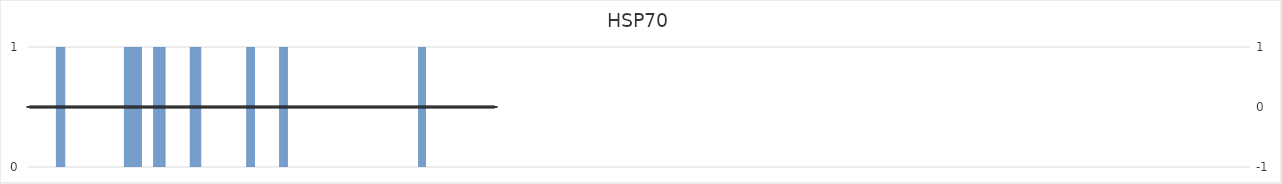
| Category | HSP70 |
|---|---|
| 1.0 | 0 |
| 2.0 | 0 |
| 3.0 | 0 |
| 4.0 | 0 |
| 5.0 | 0 |
| 6.0 | 0 |
| 7.0 | 0 |
| 8.0 | 0 |
| 9.0 | 0 |
| 10.0 | 0 |
| 11.0 | 0 |
| 12.0 | 0 |
| 13.0 | 0 |
| 14.0 | 0 |
| 15.0 | 0 |
| 16.0 | 0 |
| 17.0 | 0 |
| 18.0 | 0 |
| 19.0 | 0 |
| 20.0 | 0 |
| 21.0 | 0 |
| 22.0 | 0 |
| 23.0 | 0 |
| 24.0 | 0 |
| 25.0 | 0 |
| 26.0 | 0 |
| 27.0 | 0 |
| 28.0 | 0 |
| 29.0 | 0 |
| 30.0 | 0 |
| 31.0 | 0 |
| 32.0 | 0 |
| 33.0 | 0 |
| 34.0 | 0 |
| 35.0 | 0 |
| 36.0 | 0 |
| 37.0 | 0 |
| 38.0 | 0 |
| 39.0 | 0 |
| 40.0 | 1 |
| 41.0 | 1 |
| 42.0 | 1 |
| 43.0 | 1 |
| 44.0 | 1 |
| 45.0 | 1 |
| 46.0 | 1 |
| 47.0 | 1 |
| 48.0 | 1 |
| 49.0 | 1 |
| 50.0 | 1 |
| 51.0 | 1 |
| 52.0 | 1 |
| 53.0 | 0 |
| 54.0 | 0 |
| 55.0 | 0 |
| 56.0 | 0 |
| 57.0 | 0 |
| 58.0 | 0 |
| 59.0 | 0 |
| 60.0 | 0 |
| 61.0 | 0 |
| 62.0 | 0 |
| 63.0 | 0 |
| 64.0 | 0 |
| 65.0 | 0 |
| 66.0 | 0 |
| 67.0 | 0 |
| 68.0 | 0 |
| 69.0 | 0 |
| 70.0 | 0 |
| 71.0 | 0 |
| 72.0 | 0 |
| 73.0 | 0 |
| 74.0 | 0 |
| 75.0 | 0 |
| 76.0 | 0 |
| 77.0 | 0 |
| 78.0 | 0 |
| 79.0 | 0 |
| 80.0 | 0 |
| 81.0 | 0 |
| 82.0 | 0 |
| 83.0 | 0 |
| 84.0 | 0 |
| 85.0 | 0 |
| 86.0 | 0 |
| 87.0 | 0 |
| 88.0 | 0 |
| 89.0 | 0 |
| 90.0 | 0 |
| 91.0 | 0 |
| 92.0 | 0 |
| 93.0 | 0 |
| 94.0 | 0 |
| 95.0 | 0 |
| 96.0 | 0 |
| 97.0 | 0 |
| 98.0 | 0 |
| 99.0 | 0 |
| 100.0 | 0 |
| 101.0 | 0 |
| 102.0 | 0 |
| 103.0 | 0 |
| 104.0 | 0 |
| 105.0 | 0 |
| 106.0 | 0 |
| 107.0 | 0 |
| 108.0 | 0 |
| 109.0 | 0 |
| 110.0 | 0 |
| 111.0 | 0 |
| 112.0 | 0 |
| 113.0 | 0 |
| 114.0 | 0 |
| 115.0 | 0 |
| 116.0 | 0 |
| 117.0 | 0 |
| 118.0 | 0 |
| 119.0 | 0 |
| 120.0 | 0 |
| 121.0 | 0 |
| 122.0 | 0 |
| 123.0 | 0 |
| 124.0 | 0 |
| 125.0 | 0 |
| 126.0 | 0 |
| 127.0 | 0 |
| 128.0 | 0 |
| 129.0 | 0 |
| 130.0 | 0 |
| 131.0 | 0 |
| 132.0 | 0 |
| 133.0 | 0 |
| 134.0 | 0 |
| 135.0 | 1 |
| 136.0 | 1 |
| 137.0 | 1 |
| 138.0 | 1 |
| 139.0 | 1 |
| 140.0 | 1 |
| 141.0 | 1 |
| 142.0 | 1 |
| 143.0 | 1 |
| 144.0 | 1 |
| 145.0 | 1 |
| 146.0 | 1 |
| 147.0 | 1 |
| 148.0 | 1 |
| 149.0 | 1 |
| 150.0 | 1 |
| 151.0 | 1 |
| 152.0 | 1 |
| 153.0 | 1 |
| 154.0 | 1 |
| 155.0 | 1 |
| 156.0 | 1 |
| 157.0 | 1 |
| 158.0 | 1 |
| 159.0 | 1 |
| 160.0 | 0 |
| 161.0 | 0 |
| 162.0 | 0 |
| 163.0 | 0 |
| 164.0 | 0 |
| 165.0 | 0 |
| 166.0 | 0 |
| 167.0 | 0 |
| 168.0 | 0 |
| 169.0 | 0 |
| 170.0 | 0 |
| 171.0 | 0 |
| 172.0 | 0 |
| 173.0 | 0 |
| 174.0 | 0 |
| 175.0 | 0 |
| 176.0 | 1 |
| 177.0 | 1 |
| 178.0 | 1 |
| 179.0 | 1 |
| 180.0 | 1 |
| 181.0 | 1 |
| 182.0 | 1 |
| 183.0 | 1 |
| 184.0 | 1 |
| 185.0 | 1 |
| 186.0 | 1 |
| 187.0 | 1 |
| 188.0 | 1 |
| 189.0 | 1 |
| 190.0 | 1 |
| 191.0 | 1 |
| 192.0 | 1 |
| 193.0 | 0 |
| 194.0 | 0 |
| 195.0 | 0 |
| 196.0 | 0 |
| 197.0 | 0 |
| 198.0 | 0 |
| 199.0 | 0 |
| 200.0 | 0 |
| 201.0 | 0 |
| 202.0 | 0 |
| 203.0 | 0 |
| 204.0 | 0 |
| 205.0 | 0 |
| 206.0 | 0 |
| 207.0 | 0 |
| 208.0 | 0 |
| 209.0 | 0 |
| 210.0 | 0 |
| 211.0 | 0 |
| 212.0 | 0 |
| 213.0 | 0 |
| 214.0 | 0 |
| 215.0 | 0 |
| 216.0 | 0 |
| 217.0 | 0 |
| 218.0 | 0 |
| 219.0 | 0 |
| 220.0 | 0 |
| 221.0 | 0 |
| 222.0 | 0 |
| 223.0 | 0 |
| 224.0 | 0 |
| 225.0 | 0 |
| 226.0 | 0 |
| 227.0 | 1 |
| 228.0 | 1 |
| 229.0 | 1 |
| 230.0 | 1 |
| 231.0 | 1 |
| 232.0 | 1 |
| 233.0 | 1 |
| 234.0 | 1 |
| 235.0 | 1 |
| 236.0 | 1 |
| 237.0 | 1 |
| 238.0 | 1 |
| 239.0 | 1 |
| 240.0 | 1 |
| 241.0 | 1 |
| 242.0 | 1 |
| 243.0 | 0 |
| 244.0 | 0 |
| 245.0 | 0 |
| 246.0 | 0 |
| 247.0 | 0 |
| 248.0 | 0 |
| 249.0 | 0 |
| 250.0 | 0 |
| 251.0 | 0 |
| 252.0 | 0 |
| 253.0 | 0 |
| 254.0 | 0 |
| 255.0 | 0 |
| 256.0 | 0 |
| 257.0 | 0 |
| 258.0 | 0 |
| 259.0 | 0 |
| 260.0 | 0 |
| 261.0 | 0 |
| 262.0 | 0 |
| 263.0 | 0 |
| 264.0 | 0 |
| 265.0 | 0 |
| 266.0 | 0 |
| 267.0 | 0 |
| 268.0 | 0 |
| 269.0 | 0 |
| 270.0 | 0 |
| 271.0 | 0 |
| 272.0 | 0 |
| 273.0 | 0 |
| 274.0 | 0 |
| 275.0 | 0 |
| 276.0 | 0 |
| 277.0 | 0 |
| 278.0 | 0 |
| 279.0 | 0 |
| 280.0 | 0 |
| 281.0 | 0 |
| 282.0 | 0 |
| 283.0 | 0 |
| 284.0 | 0 |
| 285.0 | 0 |
| 286.0 | 0 |
| 287.0 | 0 |
| 288.0 | 0 |
| 289.0 | 0 |
| 290.0 | 0 |
| 291.0 | 0 |
| 292.0 | 0 |
| 293.0 | 0 |
| 294.0 | 0 |
| 295.0 | 0 |
| 296.0 | 0 |
| 297.0 | 0 |
| 298.0 | 0 |
| 299.0 | 0 |
| 300.0 | 0 |
| 301.0 | 0 |
| 302.0 | 0 |
| 303.0 | 0 |
| 304.0 | 0 |
| 305.0 | 0 |
| 306.0 | 1 |
| 307.0 | 1 |
| 308.0 | 1 |
| 309.0 | 1 |
| 310.0 | 1 |
| 311.0 | 1 |
| 312.0 | 1 |
| 313.0 | 1 |
| 314.0 | 1 |
| 315.0 | 1 |
| 316.0 | 1 |
| 317.0 | 1 |
| 318.0 | 0 |
| 319.0 | 0 |
| 320.0 | 0 |
| 321.0 | 0 |
| 322.0 | 0 |
| 323.0 | 0 |
| 324.0 | 0 |
| 325.0 | 0 |
| 326.0 | 0 |
| 327.0 | 0 |
| 328.0 | 0 |
| 329.0 | 0 |
| 330.0 | 0 |
| 331.0 | 0 |
| 332.0 | 0 |
| 333.0 | 0 |
| 334.0 | 0 |
| 335.0 | 0 |
| 336.0 | 0 |
| 337.0 | 0 |
| 338.0 | 0 |
| 339.0 | 0 |
| 340.0 | 0 |
| 341.0 | 0 |
| 342.0 | 0 |
| 343.0 | 0 |
| 344.0 | 0 |
| 345.0 | 0 |
| 346.0 | 0 |
| 347.0 | 0 |
| 348.0 | 0 |
| 349.0 | 0 |
| 350.0 | 0 |
| 351.0 | 0 |
| 352.0 | 1 |
| 353.0 | 1 |
| 354.0 | 1 |
| 355.0 | 1 |
| 356.0 | 1 |
| 357.0 | 1 |
| 358.0 | 1 |
| 359.0 | 1 |
| 360.0 | 1 |
| 361.0 | 1 |
| 362.0 | 1 |
| 363.0 | 1 |
| 364.0 | 0 |
| 365.0 | 0 |
| 366.0 | 0 |
| 367.0 | 0 |
| 368.0 | 0 |
| 369.0 | 0 |
| 370.0 | 0 |
| 371.0 | 0 |
| 372.0 | 0 |
| 373.0 | 0 |
| 374.0 | 0 |
| 375.0 | 0 |
| 376.0 | 0 |
| 377.0 | 0 |
| 378.0 | 0 |
| 379.0 | 0 |
| 380.0 | 0 |
| 381.0 | 0 |
| 382.0 | 0 |
| 383.0 | 0 |
| 384.0 | 0 |
| 385.0 | 0 |
| 386.0 | 0 |
| 387.0 | 0 |
| 388.0 | 0 |
| 389.0 | 0 |
| 390.0 | 0 |
| 391.0 | 0 |
| 392.0 | 0 |
| 393.0 | 0 |
| 394.0 | 0 |
| 395.0 | 0 |
| 396.0 | 0 |
| 397.0 | 0 |
| 398.0 | 0 |
| 399.0 | 0 |
| 400.0 | 0 |
| 401.0 | 0 |
| 402.0 | 0 |
| 403.0 | 0 |
| 404.0 | 0 |
| 405.0 | 0 |
| 406.0 | 0 |
| 407.0 | 0 |
| 408.0 | 0 |
| 409.0 | 0 |
| 410.0 | 0 |
| 411.0 | 0 |
| 412.0 | 0 |
| 413.0 | 0 |
| 414.0 | 0 |
| 415.0 | 0 |
| 416.0 | 0 |
| 417.0 | 0 |
| 418.0 | 0 |
| 419.0 | 0 |
| 420.0 | 0 |
| 421.0 | 0 |
| 422.0 | 0 |
| 423.0 | 0 |
| 424.0 | 0 |
| 425.0 | 0 |
| 426.0 | 0 |
| 427.0 | 0 |
| 428.0 | 0 |
| 429.0 | 0 |
| 430.0 | 0 |
| 431.0 | 0 |
| 432.0 | 0 |
| 433.0 | 0 |
| 434.0 | 0 |
| 435.0 | 0 |
| 436.0 | 0 |
| 437.0 | 0 |
| 438.0 | 0 |
| 439.0 | 0 |
| 440.0 | 0 |
| 441.0 | 0 |
| 442.0 | 0 |
| 443.0 | 0 |
| 444.0 | 0 |
| 445.0 | 0 |
| 446.0 | 0 |
| 447.0 | 0 |
| 448.0 | 0 |
| 449.0 | 0 |
| 450.0 | 0 |
| 451.0 | 0 |
| 452.0 | 0 |
| 453.0 | 0 |
| 454.0 | 0 |
| 455.0 | 0 |
| 456.0 | 0 |
| 457.0 | 0 |
| 458.0 | 0 |
| 459.0 | 0 |
| 460.0 | 0 |
| 461.0 | 0 |
| 462.0 | 0 |
| 463.0 | 0 |
| 464.0 | 0 |
| 465.0 | 0 |
| 466.0 | 0 |
| 467.0 | 0 |
| 468.0 | 0 |
| 469.0 | 0 |
| 470.0 | 0 |
| 471.0 | 0 |
| 472.0 | 0 |
| 473.0 | 0 |
| 474.0 | 0 |
| 475.0 | 0 |
| 476.0 | 0 |
| 477.0 | 0 |
| 478.0 | 0 |
| 479.0 | 0 |
| 480.0 | 0 |
| 481.0 | 0 |
| 482.0 | 0 |
| 483.0 | 0 |
| 484.0 | 0 |
| 485.0 | 0 |
| 486.0 | 0 |
| 487.0 | 0 |
| 488.0 | 0 |
| 489.0 | 0 |
| 490.0 | 0 |
| 491.0 | 0 |
| 492.0 | 0 |
| 493.0 | 0 |
| 494.0 | 0 |
| 495.0 | 0 |
| 496.0 | 0 |
| 497.0 | 0 |
| 498.0 | 0 |
| 499.0 | 0 |
| 500.0 | 0 |
| 501.0 | 0 |
| 502.0 | 0 |
| 503.0 | 0 |
| 504.0 | 0 |
| 505.0 | 0 |
| 506.0 | 0 |
| 507.0 | 0 |
| 508.0 | 0 |
| 509.0 | 0 |
| 510.0 | 0 |
| 511.0 | 0 |
| 512.0 | 0 |
| 513.0 | 0 |
| 514.0 | 0 |
| 515.0 | 0 |
| 516.0 | 0 |
| 517.0 | 0 |
| 518.0 | 0 |
| 519.0 | 0 |
| 520.0 | 0 |
| 521.0 | 0 |
| 522.0 | 0 |
| 523.0 | 0 |
| 524.0 | 0 |
| 525.0 | 0 |
| 526.0 | 0 |
| 527.0 | 0 |
| 528.0 | 0 |
| 529.0 | 0 |
| 530.0 | 0 |
| 531.0 | 0 |
| 532.0 | 0 |
| 533.0 | 0 |
| 534.0 | 0 |
| 535.0 | 0 |
| 536.0 | 0 |
| 537.0 | 0 |
| 538.0 | 0 |
| 539.0 | 0 |
| 540.0 | 0 |
| 541.0 | 0 |
| 542.0 | 0 |
| 543.0 | 0 |
| 544.0 | 0 |
| 545.0 | 0 |
| 546.0 | 1 |
| 547.0 | 1 |
| 548.0 | 1 |
| 549.0 | 1 |
| 550.0 | 1 |
| 551.0 | 1 |
| 552.0 | 1 |
| 553.0 | 1 |
| 554.0 | 1 |
| 555.0 | 1 |
| 556.0 | 1 |
| 557.0 | 0 |
| 558.0 | 0 |
| 559.0 | 0 |
| 560.0 | 0 |
| 561.0 | 0 |
| 562.0 | 0 |
| 563.0 | 0 |
| 564.0 | 0 |
| 565.0 | 0 |
| 566.0 | 0 |
| 567.0 | 0 |
| 568.0 | 0 |
| 569.0 | 0 |
| 570.0 | 0 |
| 571.0 | 0 |
| 572.0 | 0 |
| 573.0 | 0 |
| 574.0 | 0 |
| 575.0 | 0 |
| 576.0 | 0 |
| 577.0 | 0 |
| 578.0 | 0 |
| 579.0 | 0 |
| 580.0 | 0 |
| 581.0 | 0 |
| 582.0 | 0 |
| 583.0 | 0 |
| 584.0 | 0 |
| 585.0 | 0 |
| 586.0 | 0 |
| 587.0 | 0 |
| 588.0 | 0 |
| 589.0 | 0 |
| 590.0 | 0 |
| 591.0 | 0 |
| 592.0 | 0 |
| 593.0 | 0 |
| 594.0 | 0 |
| 595.0 | 0 |
| 596.0 | 0 |
| 597.0 | 0 |
| 598.0 | 0 |
| 599.0 | 0 |
| 600.0 | 0 |
| 601.0 | 0 |
| 602.0 | 0 |
| 603.0 | 0 |
| 604.0 | 0 |
| 605.0 | 0 |
| 606.0 | 0 |
| 607.0 | 0 |
| 608.0 | 0 |
| 609.0 | 0 |
| 610.0 | 0 |
| 611.0 | 0 |
| 612.0 | 0 |
| 613.0 | 0 |
| 614.0 | 0 |
| 615.0 | 0 |
| 616.0 | 0 |
| 617.0 | 0 |
| 618.0 | 0 |
| 619.0 | 0 |
| 620.0 | 0 |
| 621.0 | 0 |
| 622.0 | 0 |
| 623.0 | 0 |
| 624.0 | 0 |
| 625.0 | 0 |
| 626.0 | 0 |
| 627.0 | 0 |
| 628.0 | 0 |
| 629.0 | 0 |
| 630.0 | 0 |
| 631.0 | 0 |
| 632.0 | 0 |
| 633.0 | 0 |
| 634.0 | 0 |
| 635.0 | 0 |
| 636.0 | 0 |
| 637.0 | 0 |
| 638.0 | 0 |
| 639.0 | 0 |
| 640.0 | 0 |
| 641.0 | 0 |
| 642.0 | 0 |
| 643.0 | 0 |
| 644.0 | 0 |
| 645.0 | 0 |
| 646.0 | 0 |
| 647.0 | 0 |
| 648.0 | 0 |
| 649.0 | 0 |
| 650.0 | 0 |
| 651.0 | 0 |
| 652.0 | 0 |
| 653.0 | 0 |
| 654.0 | 0 |
| 655.0 | 0 |
| 656.0 | 0 |
| 657.0 | 0 |
| 658.0 | 0 |
| 659.0 | 0 |
| 660.0 | 0 |
| 661.0 | 0 |
| 662.0 | 0 |
| 663.0 | 0 |
| 664.0 | 0 |
| 665.0 | 0 |
| 666.0 | 0 |
| 667.0 | 0 |
| 668.0 | 0 |
| 669.0 | 0 |
| 670.0 | 0 |
| 671.0 | 0 |
| 672.0 | 0 |
| 673.0 | 0 |
| 674.0 | 0 |
| 675.0 | 0 |
| 676.0 | 0 |
| 677.0 | 0 |
| 678.0 | 0 |
| 679.0 | 0 |
| 680.0 | 0 |
| 681.0 | 0 |
| 682.0 | 0 |
| 683.0 | 0 |
| 684.0 | 0 |
| 685.0 | 0 |
| 686.0 | 0 |
| 687.0 | 0 |
| 688.0 | 0 |
| 689.0 | 0 |
| 690.0 | 0 |
| 691.0 | 0 |
| 692.0 | 0 |
| 693.0 | 0 |
| 694.0 | 0 |
| 695.0 | 0 |
| 696.0 | 0 |
| 697.0 | 0 |
| 698.0 | 0 |
| 699.0 | 0 |
| 700.0 | 0 |
| 701.0 | 0 |
| 702.0 | 0 |
| 703.0 | 0 |
| 704.0 | 0 |
| 705.0 | 0 |
| 706.0 | 0 |
| 707.0 | 0 |
| 708.0 | 0 |
| 709.0 | 0 |
| 710.0 | 0 |
| 711.0 | 0 |
| 712.0 | 0 |
| 713.0 | 0 |
| 714.0 | 0 |
| 715.0 | 0 |
| 716.0 | 0 |
| 717.0 | 0 |
| 718.0 | 0 |
| 719.0 | 0 |
| 720.0 | 0 |
| 721.0 | 0 |
| 722.0 | 0 |
| 723.0 | 0 |
| 724.0 | 0 |
| 725.0 | 0 |
| 726.0 | 0 |
| 727.0 | 0 |
| 728.0 | 0 |
| 729.0 | 0 |
| 730.0 | 0 |
| 731.0 | 0 |
| 732.0 | 0 |
| 733.0 | 0 |
| 734.0 | 0 |
| 735.0 | 0 |
| 736.0 | 0 |
| 737.0 | 0 |
| 738.0 | 0 |
| 739.0 | 0 |
| 740.0 | 0 |
| 741.0 | 0 |
| 742.0 | 0 |
| 743.0 | 0 |
| 744.0 | 0 |
| 745.0 | 0 |
| 746.0 | 0 |
| 747.0 | 0 |
| 748.0 | 0 |
| 749.0 | 0 |
| 750.0 | 0 |
| 751.0 | 0 |
| 752.0 | 0 |
| 753.0 | 0 |
| 754.0 | 0 |
| 755.0 | 0 |
| 756.0 | 0 |
| 757.0 | 0 |
| 758.0 | 0 |
| 759.0 | 0 |
| 760.0 | 0 |
| 761.0 | 0 |
| 762.0 | 0 |
| 763.0 | 0 |
| 764.0 | 0 |
| 765.0 | 0 |
| 766.0 | 0 |
| 767.0 | 0 |
| 768.0 | 0 |
| 769.0 | 0 |
| 770.0 | 0 |
| 771.0 | 0 |
| 772.0 | 0 |
| 773.0 | 0 |
| 774.0 | 0 |
| 775.0 | 0 |
| 776.0 | 0 |
| 777.0 | 0 |
| 778.0 | 0 |
| 779.0 | 0 |
| 780.0 | 0 |
| 781.0 | 0 |
| 782.0 | 0 |
| 783.0 | 0 |
| 784.0 | 0 |
| 785.0 | 0 |
| 786.0 | 0 |
| 787.0 | 0 |
| 788.0 | 0 |
| 789.0 | 0 |
| 790.0 | 0 |
| 791.0 | 0 |
| 792.0 | 0 |
| 793.0 | 0 |
| 794.0 | 0 |
| 795.0 | 0 |
| 796.0 | 0 |
| 797.0 | 0 |
| 798.0 | 0 |
| 799.0 | 0 |
| 800.0 | 0 |
| 801.0 | 0 |
| 802.0 | 0 |
| 803.0 | 0 |
| 804.0 | 0 |
| 805.0 | 0 |
| 806.0 | 0 |
| 807.0 | 0 |
| 808.0 | 0 |
| 809.0 | 0 |
| 810.0 | 0 |
| 811.0 | 0 |
| 812.0 | 0 |
| 813.0 | 0 |
| 814.0 | 0 |
| 815.0 | 0 |
| 816.0 | 0 |
| 817.0 | 0 |
| 818.0 | 0 |
| 819.0 | 0 |
| 820.0 | 0 |
| 821.0 | 0 |
| 822.0 | 0 |
| 823.0 | 0 |
| 824.0 | 0 |
| 825.0 | 0 |
| 826.0 | 0 |
| 827.0 | 0 |
| 828.0 | 0 |
| 829.0 | 0 |
| 830.0 | 0 |
| 831.0 | 0 |
| 832.0 | 0 |
| 833.0 | 0 |
| 834.0 | 0 |
| 835.0 | 0 |
| 836.0 | 0 |
| 837.0 | 0 |
| 838.0 | 0 |
| 839.0 | 0 |
| 840.0 | 0 |
| 841.0 | 0 |
| 842.0 | 0 |
| 843.0 | 0 |
| 844.0 | 0 |
| 845.0 | 0 |
| 846.0 | 0 |
| 847.0 | 0 |
| 848.0 | 0 |
| 849.0 | 0 |
| 850.0 | 0 |
| 851.0 | 0 |
| 852.0 | 0 |
| 853.0 | 0 |
| 854.0 | 0 |
| 855.0 | 0 |
| 856.0 | 0 |
| 857.0 | 0 |
| 858.0 | 0 |
| 859.0 | 0 |
| 860.0 | 0 |
| 861.0 | 0 |
| 862.0 | 0 |
| 863.0 | 0 |
| 864.0 | 0 |
| 865.0 | 0 |
| 866.0 | 0 |
| 867.0 | 0 |
| 868.0 | 0 |
| 869.0 | 0 |
| 870.0 | 0 |
| 871.0 | 0 |
| 872.0 | 0 |
| 873.0 | 0 |
| 874.0 | 0 |
| 875.0 | 0 |
| 876.0 | 0 |
| 877.0 | 0 |
| 878.0 | 0 |
| 879.0 | 0 |
| 880.0 | 0 |
| 881.0 | 0 |
| 882.0 | 0 |
| 883.0 | 0 |
| 884.0 | 0 |
| 885.0 | 0 |
| 886.0 | 0 |
| 887.0 | 0 |
| 888.0 | 0 |
| 889.0 | 0 |
| 890.0 | 0 |
| 891.0 | 0 |
| 892.0 | 0 |
| 893.0 | 0 |
| 894.0 | 0 |
| 895.0 | 0 |
| 896.0 | 0 |
| 897.0 | 0 |
| 898.0 | 0 |
| 899.0 | 0 |
| 900.0 | 0 |
| 901.0 | 0 |
| 902.0 | 0 |
| 903.0 | 0 |
| 904.0 | 0 |
| 905.0 | 0 |
| 906.0 | 0 |
| 907.0 | 0 |
| 908.0 | 0 |
| 909.0 | 0 |
| 910.0 | 0 |
| 911.0 | 0 |
| 912.0 | 0 |
| 913.0 | 0 |
| 914.0 | 0 |
| 915.0 | 0 |
| 916.0 | 0 |
| 917.0 | 0 |
| 918.0 | 0 |
| 919.0 | 0 |
| 920.0 | 0 |
| 921.0 | 0 |
| 922.0 | 0 |
| 923.0 | 0 |
| 924.0 | 0 |
| 925.0 | 0 |
| 926.0 | 0 |
| 927.0 | 0 |
| 928.0 | 0 |
| 929.0 | 0 |
| 930.0 | 0 |
| 931.0 | 0 |
| 932.0 | 0 |
| 933.0 | 0 |
| 934.0 | 0 |
| 935.0 | 0 |
| 936.0 | 0 |
| 937.0 | 0 |
| 938.0 | 0 |
| 939.0 | 0 |
| 940.0 | 0 |
| 941.0 | 0 |
| 942.0 | 0 |
| 943.0 | 0 |
| 944.0 | 0 |
| 945.0 | 0 |
| 946.0 | 0 |
| 947.0 | 0 |
| 948.0 | 0 |
| 949.0 | 0 |
| 950.0 | 0 |
| 951.0 | 0 |
| 952.0 | 0 |
| 953.0 | 0 |
| 954.0 | 0 |
| 955.0 | 0 |
| 956.0 | 0 |
| 957.0 | 0 |
| 958.0 | 0 |
| 959.0 | 0 |
| 960.0 | 0 |
| 961.0 | 0 |
| 962.0 | 0 |
| 963.0 | 0 |
| 964.0 | 0 |
| 965.0 | 0 |
| 966.0 | 0 |
| 967.0 | 0 |
| 968.0 | 0 |
| 969.0 | 0 |
| 970.0 | 0 |
| 971.0 | 0 |
| 972.0 | 0 |
| 973.0 | 0 |
| 974.0 | 0 |
| 975.0 | 0 |
| 976.0 | 0 |
| 977.0 | 0 |
| 978.0 | 0 |
| 979.0 | 0 |
| 980.0 | 0 |
| 981.0 | 0 |
| 982.0 | 0 |
| 983.0 | 0 |
| 984.0 | 0 |
| 985.0 | 0 |
| 986.0 | 0 |
| 987.0 | 0 |
| 988.0 | 0 |
| 989.0 | 0 |
| 990.0 | 0 |
| 991.0 | 0 |
| 992.0 | 0 |
| 993.0 | 0 |
| 994.0 | 0 |
| 995.0 | 0 |
| 996.0 | 0 |
| 997.0 | 0 |
| 998.0 | 0 |
| 999.0 | 0 |
| 1000.0 | 0 |
| 1001.0 | 0 |
| 1002.0 | 0 |
| 1003.0 | 0 |
| 1004.0 | 0 |
| 1005.0 | 0 |
| 1006.0 | 0 |
| 1007.0 | 0 |
| 1008.0 | 0 |
| 1009.0 | 0 |
| 1010.0 | 0 |
| 1011.0 | 0 |
| 1012.0 | 0 |
| 1013.0 | 0 |
| 1014.0 | 0 |
| 1015.0 | 0 |
| 1016.0 | 0 |
| 1017.0 | 0 |
| 1018.0 | 0 |
| 1019.0 | 0 |
| 1020.0 | 0 |
| 1021.0 | 0 |
| 1022.0 | 0 |
| 1023.0 | 0 |
| 1024.0 | 0 |
| 1025.0 | 0 |
| 1026.0 | 0 |
| 1027.0 | 0 |
| 1028.0 | 0 |
| 1029.0 | 0 |
| 1030.0 | 0 |
| 1031.0 | 0 |
| 1032.0 | 0 |
| 1033.0 | 0 |
| 1034.0 | 0 |
| 1035.0 | 0 |
| 1036.0 | 0 |
| 1037.0 | 0 |
| 1038.0 | 0 |
| 1039.0 | 0 |
| 1040.0 | 0 |
| 1041.0 | 0 |
| 1042.0 | 0 |
| 1043.0 | 0 |
| 1044.0 | 0 |
| 1045.0 | 0 |
| 1046.0 | 0 |
| 1047.0 | 0 |
| 1048.0 | 0 |
| 1049.0 | 0 |
| 1050.0 | 0 |
| 1051.0 | 0 |
| 1052.0 | 0 |
| 1053.0 | 0 |
| 1054.0 | 0 |
| 1055.0 | 0 |
| 1056.0 | 0 |
| 1057.0 | 0 |
| 1058.0 | 0 |
| 1059.0 | 0 |
| 1060.0 | 0 |
| 1061.0 | 0 |
| 1062.0 | 0 |
| 1063.0 | 0 |
| 1064.0 | 0 |
| 1065.0 | 0 |
| 1066.0 | 0 |
| 1067.0 | 0 |
| 1068.0 | 0 |
| 1069.0 | 0 |
| 1070.0 | 0 |
| 1071.0 | 0 |
| 1072.0 | 0 |
| 1073.0 | 0 |
| 1074.0 | 0 |
| 1075.0 | 0 |
| 1076.0 | 0 |
| 1077.0 | 0 |
| 1078.0 | 0 |
| 1079.0 | 0 |
| 1080.0 | 0 |
| 1081.0 | 0 |
| 1082.0 | 0 |
| 1083.0 | 0 |
| 1084.0 | 0 |
| 1085.0 | 0 |
| 1086.0 | 0 |
| 1087.0 | 0 |
| 1088.0 | 0 |
| 1089.0 | 0 |
| 1090.0 | 0 |
| 1091.0 | 0 |
| 1092.0 | 0 |
| 1093.0 | 0 |
| 1094.0 | 0 |
| 1095.0 | 0 |
| 1096.0 | 0 |
| 1097.0 | 0 |
| 1098.0 | 0 |
| 1099.0 | 0 |
| 1100.0 | 0 |
| 1101.0 | 0 |
| 1102.0 | 0 |
| 1103.0 | 0 |
| 1104.0 | 0 |
| 1105.0 | 0 |
| 1106.0 | 0 |
| 1107.0 | 0 |
| 1108.0 | 0 |
| 1109.0 | 0 |
| 1110.0 | 0 |
| 1111.0 | 0 |
| 1112.0 | 0 |
| 1113.0 | 0 |
| 1114.0 | 0 |
| 1115.0 | 0 |
| 1116.0 | 0 |
| 1117.0 | 0 |
| 1118.0 | 0 |
| 1119.0 | 0 |
| 1120.0 | 0 |
| 1121.0 | 0 |
| 1122.0 | 0 |
| 1123.0 | 0 |
| 1124.0 | 0 |
| 1125.0 | 0 |
| 1126.0 | 0 |
| 1127.0 | 0 |
| 1128.0 | 0 |
| 1129.0 | 0 |
| 1130.0 | 0 |
| 1131.0 | 0 |
| 1132.0 | 0 |
| 1133.0 | 0 |
| 1134.0 | 0 |
| 1135.0 | 0 |
| 1136.0 | 0 |
| 1137.0 | 0 |
| 1138.0 | 0 |
| 1139.0 | 0 |
| 1140.0 | 0 |
| 1141.0 | 0 |
| 1142.0 | 0 |
| 1143.0 | 0 |
| 1144.0 | 0 |
| 1145.0 | 0 |
| 1146.0 | 0 |
| 1147.0 | 0 |
| 1148.0 | 0 |
| 1149.0 | 0 |
| 1150.0 | 0 |
| 1151.0 | 0 |
| 1152.0 | 0 |
| 1153.0 | 0 |
| 1154.0 | 0 |
| 1155.0 | 0 |
| 1156.0 | 0 |
| 1157.0 | 0 |
| 1158.0 | 0 |
| 1159.0 | 0 |
| 1160.0 | 0 |
| 1161.0 | 0 |
| 1162.0 | 0 |
| 1163.0 | 0 |
| 1164.0 | 0 |
| 1165.0 | 0 |
| 1166.0 | 0 |
| 1167.0 | 0 |
| 1168.0 | 0 |
| 1169.0 | 0 |
| 1170.0 | 0 |
| 1171.0 | 0 |
| 1172.0 | 0 |
| 1173.0 | 0 |
| 1174.0 | 0 |
| 1175.0 | 0 |
| 1176.0 | 0 |
| 1177.0 | 0 |
| 1178.0 | 0 |
| 1179.0 | 0 |
| 1180.0 | 0 |
| 1181.0 | 0 |
| 1182.0 | 0 |
| 1183.0 | 0 |
| 1184.0 | 0 |
| 1185.0 | 0 |
| 1186.0 | 0 |
| 1187.0 | 0 |
| 1188.0 | 0 |
| 1189.0 | 0 |
| 1190.0 | 0 |
| 1191.0 | 0 |
| 1192.0 | 0 |
| 1193.0 | 0 |
| 1194.0 | 0 |
| 1195.0 | 0 |
| 1196.0 | 0 |
| 1197.0 | 0 |
| 1198.0 | 0 |
| 1199.0 | 0 |
| 1200.0 | 0 |
| 1201.0 | 0 |
| 1202.0 | 0 |
| 1203.0 | 0 |
| 1204.0 | 0 |
| 1205.0 | 0 |
| 1206.0 | 0 |
| 1207.0 | 0 |
| 1208.0 | 0 |
| 1209.0 | 0 |
| 1210.0 | 0 |
| 1211.0 | 0 |
| 1212.0 | 0 |
| 1213.0 | 0 |
| 1214.0 | 0 |
| 1215.0 | 0 |
| 1216.0 | 0 |
| 1217.0 | 0 |
| 1218.0 | 0 |
| 1219.0 | 0 |
| 1220.0 | 0 |
| 1221.0 | 0 |
| 1222.0 | 0 |
| 1223.0 | 0 |
| 1224.0 | 0 |
| 1225.0 | 0 |
| 1226.0 | 0 |
| 1227.0 | 0 |
| 1228.0 | 0 |
| 1229.0 | 0 |
| 1230.0 | 0 |
| 1231.0 | 0 |
| 1232.0 | 0 |
| 1233.0 | 0 |
| 1234.0 | 0 |
| 1235.0 | 0 |
| 1236.0 | 0 |
| 1237.0 | 0 |
| 1238.0 | 0 |
| 1239.0 | 0 |
| 1240.0 | 0 |
| 1241.0 | 0 |
| 1242.0 | 0 |
| 1243.0 | 0 |
| 1244.0 | 0 |
| 1245.0 | 0 |
| 1246.0 | 0 |
| 1247.0 | 0 |
| 1248.0 | 0 |
| 1249.0 | 0 |
| 1250.0 | 0 |
| 1251.0 | 0 |
| 1252.0 | 0 |
| 1253.0 | 0 |
| 1254.0 | 0 |
| 1255.0 | 0 |
| 1256.0 | 0 |
| 1257.0 | 0 |
| 1258.0 | 0 |
| 1259.0 | 0 |
| 1260.0 | 0 |
| 1261.0 | 0 |
| 1262.0 | 0 |
| 1263.0 | 0 |
| 1264.0 | 0 |
| 1265.0 | 0 |
| 1266.0 | 0 |
| 1267.0 | 0 |
| 1268.0 | 0 |
| 1269.0 | 0 |
| 1270.0 | 0 |
| 1271.0 | 0 |
| 1272.0 | 0 |
| 1273.0 | 0 |
| 1274.0 | 0 |
| 1275.0 | 0 |
| 1276.0 | 0 |
| 1277.0 | 0 |
| 1278.0 | 0 |
| 1279.0 | 0 |
| 1280.0 | 0 |
| 1281.0 | 0 |
| 1282.0 | 0 |
| 1283.0 | 0 |
| 1284.0 | 0 |
| 1285.0 | 0 |
| 1286.0 | 0 |
| 1287.0 | 0 |
| 1288.0 | 0 |
| 1289.0 | 0 |
| 1290.0 | 0 |
| 1291.0 | 0 |
| 1292.0 | 0 |
| 1293.0 | 0 |
| 1294.0 | 0 |
| 1295.0 | 0 |
| 1296.0 | 0 |
| 1297.0 | 0 |
| 1298.0 | 0 |
| 1299.0 | 0 |
| 1300.0 | 0 |
| 1301.0 | 0 |
| 1302.0 | 0 |
| 1303.0 | 0 |
| 1304.0 | 0 |
| 1305.0 | 0 |
| 1306.0 | 0 |
| 1307.0 | 0 |
| 1308.0 | 0 |
| 1309.0 | 0 |
| 1310.0 | 0 |
| 1311.0 | 0 |
| 1312.0 | 0 |
| 1313.0 | 0 |
| 1314.0 | 0 |
| 1315.0 | 0 |
| 1316.0 | 0 |
| 1317.0 | 0 |
| 1318.0 | 0 |
| 1319.0 | 0 |
| 1320.0 | 0 |
| 1321.0 | 0 |
| 1322.0 | 0 |
| 1323.0 | 0 |
| 1324.0 | 0 |
| 1325.0 | 0 |
| 1326.0 | 0 |
| 1327.0 | 0 |
| 1328.0 | 0 |
| 1329.0 | 0 |
| 1330.0 | 0 |
| 1331.0 | 0 |
| 1332.0 | 0 |
| 1333.0 | 0 |
| 1334.0 | 0 |
| 1335.0 | 0 |
| 1336.0 | 0 |
| 1337.0 | 0 |
| 1338.0 | 0 |
| 1339.0 | 0 |
| 1340.0 | 0 |
| 1341.0 | 0 |
| 1342.0 | 0 |
| 1343.0 | 0 |
| 1344.0 | 0 |
| 1345.0 | 0 |
| 1346.0 | 0 |
| 1347.0 | 0 |
| 1348.0 | 0 |
| 1349.0 | 0 |
| 1350.0 | 0 |
| 1351.0 | 0 |
| 1352.0 | 0 |
| 1353.0 | 0 |
| 1354.0 | 0 |
| 1355.0 | 0 |
| 1356.0 | 0 |
| 1357.0 | 0 |
| 1358.0 | 0 |
| 1359.0 | 0 |
| 1360.0 | 0 |
| 1361.0 | 0 |
| 1362.0 | 0 |
| 1363.0 | 0 |
| 1364.0 | 0 |
| 1365.0 | 0 |
| 1366.0 | 0 |
| 1367.0 | 0 |
| 1368.0 | 0 |
| 1369.0 | 0 |
| 1370.0 | 0 |
| 1371.0 | 0 |
| 1372.0 | 0 |
| 1373.0 | 0 |
| 1374.0 | 0 |
| 1375.0 | 0 |
| 1376.0 | 0 |
| 1377.0 | 0 |
| 1378.0 | 0 |
| 1379.0 | 0 |
| 1380.0 | 0 |
| 1381.0 | 0 |
| 1382.0 | 0 |
| 1383.0 | 0 |
| 1384.0 | 0 |
| 1385.0 | 0 |
| 1386.0 | 0 |
| 1387.0 | 0 |
| 1388.0 | 0 |
| 1389.0 | 0 |
| 1390.0 | 0 |
| 1391.0 | 0 |
| 1392.0 | 0 |
| 1393.0 | 0 |
| 1394.0 | 0 |
| 1395.0 | 0 |
| 1396.0 | 0 |
| 1397.0 | 0 |
| 1398.0 | 0 |
| 1399.0 | 0 |
| 1400.0 | 0 |
| 1401.0 | 0 |
| 1402.0 | 0 |
| 1403.0 | 0 |
| 1404.0 | 0 |
| 1405.0 | 0 |
| 1406.0 | 0 |
| 1407.0 | 0 |
| 1408.0 | 0 |
| 1409.0 | 0 |
| 1410.0 | 0 |
| 1411.0 | 0 |
| 1412.0 | 0 |
| 1413.0 | 0 |
| 1414.0 | 0 |
| 1415.0 | 0 |
| 1416.0 | 0 |
| 1417.0 | 0 |
| 1418.0 | 0 |
| 1419.0 | 0 |
| 1420.0 | 0 |
| 1421.0 | 0 |
| 1422.0 | 0 |
| 1423.0 | 0 |
| 1424.0 | 0 |
| 1425.0 | 0 |
| 1426.0 | 0 |
| 1427.0 | 0 |
| 1428.0 | 0 |
| 1429.0 | 0 |
| 1430.0 | 0 |
| 1431.0 | 0 |
| 1432.0 | 0 |
| 1433.0 | 0 |
| 1434.0 | 0 |
| 1435.0 | 0 |
| 1436.0 | 0 |
| 1437.0 | 0 |
| 1438.0 | 0 |
| 1439.0 | 0 |
| 1440.0 | 0 |
| 1441.0 | 0 |
| 1442.0 | 0 |
| 1443.0 | 0 |
| 1444.0 | 0 |
| 1445.0 | 0 |
| 1446.0 | 0 |
| 1447.0 | 0 |
| 1448.0 | 0 |
| 1449.0 | 0 |
| 1450.0 | 0 |
| 1451.0 | 0 |
| 1452.0 | 0 |
| 1453.0 | 0 |
| 1454.0 | 0 |
| 1455.0 | 0 |
| 1456.0 | 0 |
| 1457.0 | 0 |
| 1458.0 | 0 |
| 1459.0 | 0 |
| 1460.0 | 0 |
| 1461.0 | 0 |
| 1462.0 | 0 |
| 1463.0 | 0 |
| 1464.0 | 0 |
| 1465.0 | 0 |
| 1466.0 | 0 |
| 1467.0 | 0 |
| 1468.0 | 0 |
| 1469.0 | 0 |
| 1470.0 | 0 |
| 1471.0 | 0 |
| 1472.0 | 0 |
| 1473.0 | 0 |
| 1474.0 | 0 |
| 1475.0 | 0 |
| 1476.0 | 0 |
| 1477.0 | 0 |
| 1478.0 | 0 |
| 1479.0 | 0 |
| 1480.0 | 0 |
| 1481.0 | 0 |
| 1482.0 | 0 |
| 1483.0 | 0 |
| 1484.0 | 0 |
| 1485.0 | 0 |
| 1486.0 | 0 |
| 1487.0 | 0 |
| 1488.0 | 0 |
| 1489.0 | 0 |
| 1490.0 | 0 |
| 1491.0 | 0 |
| 1492.0 | 0 |
| 1493.0 | 0 |
| 1494.0 | 0 |
| 1495.0 | 0 |
| 1496.0 | 0 |
| 1497.0 | 0 |
| 1498.0 | 0 |
| 1499.0 | 0 |
| 1500.0 | 0 |
| 1501.0 | 0 |
| 1502.0 | 0 |
| 1503.0 | 0 |
| 1504.0 | 0 |
| 1505.0 | 0 |
| 1506.0 | 0 |
| 1507.0 | 0 |
| 1508.0 | 0 |
| 1509.0 | 0 |
| 1510.0 | 0 |
| 1511.0 | 0 |
| 1512.0 | 0 |
| 1513.0 | 0 |
| 1514.0 | 0 |
| 1515.0 | 0 |
| 1516.0 | 0 |
| 1517.0 | 0 |
| 1518.0 | 0 |
| 1519.0 | 0 |
| 1520.0 | 0 |
| 1521.0 | 0 |
| 1522.0 | 0 |
| 1523.0 | 0 |
| 1524.0 | 0 |
| 1525.0 | 0 |
| 1526.0 | 0 |
| 1527.0 | 0 |
| 1528.0 | 0 |
| 1529.0 | 0 |
| 1530.0 | 0 |
| 1531.0 | 0 |
| 1532.0 | 0 |
| 1533.0 | 0 |
| 1534.0 | 0 |
| 1535.0 | 0 |
| 1536.0 | 0 |
| 1537.0 | 0 |
| 1538.0 | 0 |
| 1539.0 | 0 |
| 1540.0 | 0 |
| 1541.0 | 0 |
| 1542.0 | 0 |
| 1543.0 | 0 |
| 1544.0 | 0 |
| 1545.0 | 0 |
| 1546.0 | 0 |
| 1547.0 | 0 |
| 1548.0 | 0 |
| 1549.0 | 0 |
| 1550.0 | 0 |
| 1551.0 | 0 |
| 1552.0 | 0 |
| 1553.0 | 0 |
| 1554.0 | 0 |
| 1555.0 | 0 |
| 1556.0 | 0 |
| 1557.0 | 0 |
| 1558.0 | 0 |
| 1559.0 | 0 |
| 1560.0 | 0 |
| 1561.0 | 0 |
| 1562.0 | 0 |
| 1563.0 | 0 |
| 1564.0 | 0 |
| 1565.0 | 0 |
| 1566.0 | 0 |
| 1567.0 | 0 |
| 1568.0 | 0 |
| 1569.0 | 0 |
| 1570.0 | 0 |
| 1571.0 | 0 |
| 1572.0 | 0 |
| 1573.0 | 0 |
| 1574.0 | 0 |
| 1575.0 | 0 |
| 1576.0 | 0 |
| 1577.0 | 0 |
| 1578.0 | 0 |
| 1579.0 | 0 |
| 1580.0 | 0 |
| 1581.0 | 0 |
| 1582.0 | 0 |
| 1583.0 | 0 |
| 1584.0 | 0 |
| 1585.0 | 0 |
| 1586.0 | 0 |
| 1587.0 | 0 |
| 1588.0 | 0 |
| 1589.0 | 0 |
| 1590.0 | 0 |
| 1591.0 | 0 |
| 1592.0 | 0 |
| 1593.0 | 0 |
| 1594.0 | 0 |
| 1595.0 | 0 |
| 1596.0 | 0 |
| 1597.0 | 0 |
| 1598.0 | 0 |
| 1599.0 | 0 |
| 1600.0 | 0 |
| 1601.0 | 0 |
| 1602.0 | 0 |
| 1603.0 | 0 |
| 1604.0 | 0 |
| 1605.0 | 0 |
| 1606.0 | 0 |
| 1607.0 | 0 |
| 1608.0 | 0 |
| 1609.0 | 0 |
| 1610.0 | 0 |
| 1611.0 | 0 |
| 1612.0 | 0 |
| 1613.0 | 0 |
| 1614.0 | 0 |
| 1615.0 | 0 |
| 1616.0 | 0 |
| 1617.0 | 0 |
| 1618.0 | 0 |
| 1619.0 | 0 |
| 1620.0 | 0 |
| 1621.0 | 0 |
| 1622.0 | 0 |
| 1623.0 | 0 |
| 1624.0 | 0 |
| 1625.0 | 0 |
| 1626.0 | 0 |
| 1627.0 | 0 |
| 1628.0 | 0 |
| 1629.0 | 0 |
| 1630.0 | 0 |
| 1631.0 | 0 |
| 1632.0 | 0 |
| 1633.0 | 0 |
| 1634.0 | 0 |
| 1635.0 | 0 |
| 1636.0 | 0 |
| 1637.0 | 0 |
| 1638.0 | 0 |
| 1639.0 | 0 |
| 1640.0 | 0 |
| 1641.0 | 0 |
| 1642.0 | 0 |
| 1643.0 | 0 |
| 1644.0 | 0 |
| 1645.0 | 0 |
| 1646.0 | 0 |
| 1647.0 | 0 |
| 1648.0 | 0 |
| 1649.0 | 0 |
| 1650.0 | 0 |
| 1651.0 | 0 |
| 1652.0 | 0 |
| 1653.0 | 0 |
| 1654.0 | 0 |
| 1655.0 | 0 |
| 1656.0 | 0 |
| 1657.0 | 0 |
| 1658.0 | 0 |
| 1659.0 | 0 |
| 1660.0 | 0 |
| 1661.0 | 0 |
| 1662.0 | 0 |
| 1663.0 | 0 |
| 1664.0 | 0 |
| 1665.0 | 0 |
| 1666.0 | 0 |
| 1667.0 | 0 |
| 1668.0 | 0 |
| 1669.0 | 0 |
| 1670.0 | 0 |
| 1671.0 | 0 |
| 1672.0 | 0 |
| 1673.0 | 0 |
| 1674.0 | 0 |
| 1675.0 | 0 |
| 1676.0 | 0 |
| 1677.0 | 0 |
| 1678.0 | 0 |
| 1679.0 | 0 |
| 1680.0 | 0 |
| 1681.0 | 0 |
| 1682.0 | 0 |
| 1683.0 | 0 |
| 1684.0 | 0 |
| 1685.0 | 0 |
| 1686.0 | 0 |
| 1687.0 | 0 |
| 1688.0 | 0 |
| 1689.0 | 0 |
| 1690.0 | 0 |
| 1691.0 | 0 |
| 1692.0 | 0 |
| 1693.0 | 0 |
| 1694.0 | 0 |
| 1695.0 | 0 |
| 1696.0 | 0 |
| 1697.0 | 0 |
| 1698.0 | 0 |
| 1699.0 | 0 |
| 1700.0 | 0 |
| 1701.0 | 0 |
| 1702.0 | 0 |
| 1703.0 | 0 |
| 1704.0 | 0 |
| 1705.0 | 0 |
| 1706.0 | 0 |
| 1707.0 | 0 |